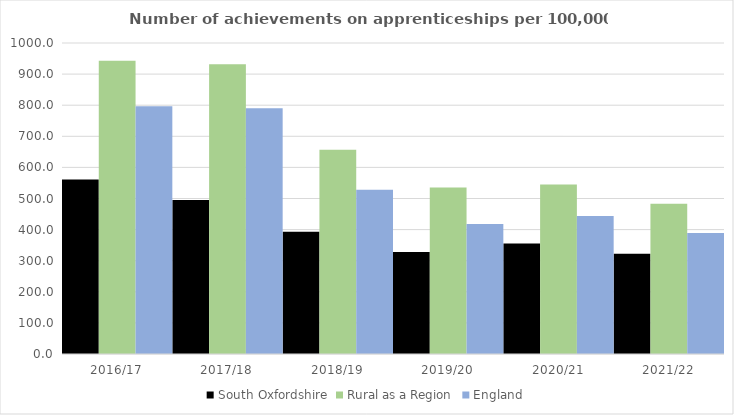
| Category | South Oxfordshire | Rural as a Region | England |
|---|---|---|---|
| 2016/17 | 561 | 942.594 | 797 |
| 2017/18 | 495 | 931.709 | 790 |
| 2018/19 | 393 | 656.44 | 528 |
| 2019/20 | 328 | 535.552 | 418 |
| 2020/21 | 355 | 545.333 | 444 |
| 2021/22 | 322 | 482.936 | 389 |